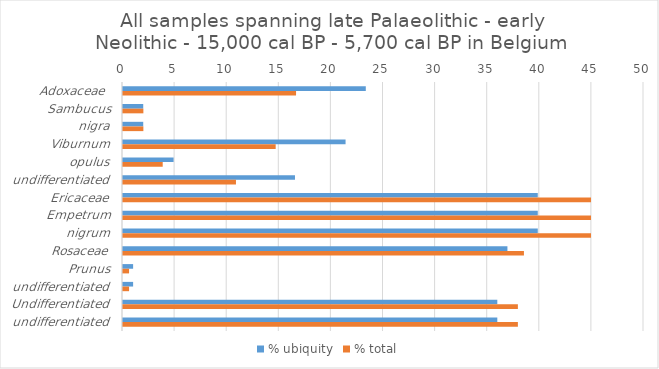
| Category | % ubiquity | % total |
|---|---|---|
| Adoxaceae  | 23.301 | 16.608 |
| Sambucus | 1.942 | 1.955 |
| nigra | 1.942 | 1.955 |
| Viburnum | 21.359 | 14.652 |
| opulus | 4.854 | 3.811 |
| undifferentiated | 16.505 | 10.841 |
| Ericaceae | 39.806 | 44.914 |
| Empetrum | 39.806 | 44.914 |
| nigrum | 39.806 | 44.914 |
| Rosaceae | 36.893 | 38.478 |
| Prunus | 0.971 | 0.582 |
| undifferentiated | 0.971 | 0.582 |
| Undifferentiated | 35.922 | 37.897 |
| undifferentiated | 35.922 | 37.897 |